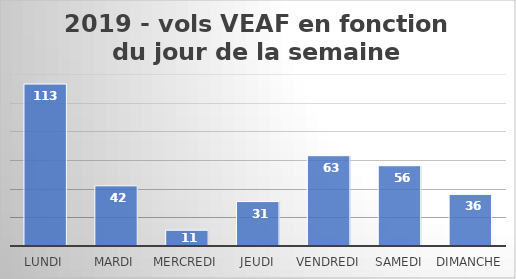
| Category | Nombre de vols |
|---|---|
| Lundi | 113 |
| Mardi | 42 |
| Mercredi | 11 |
| Jeudi | 31 |
| Vendredi | 63 |
| Samedi | 56 |
| Dimanche | 36 |